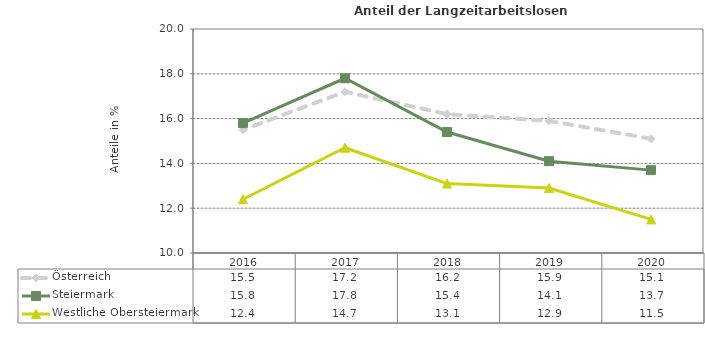
| Category | Österreich | Steiermark | Westliche Obersteiermark |
|---|---|---|---|
| 2020.0 | 15.1 | 13.7 | 11.5 |
| 2019.0 | 15.9 | 14.1 | 12.9 |
| 2018.0 | 16.2 | 15.4 | 13.1 |
| 2017.0 | 17.2 | 17.8 | 14.7 |
| 2016.0 | 15.5 | 15.8 | 12.4 |